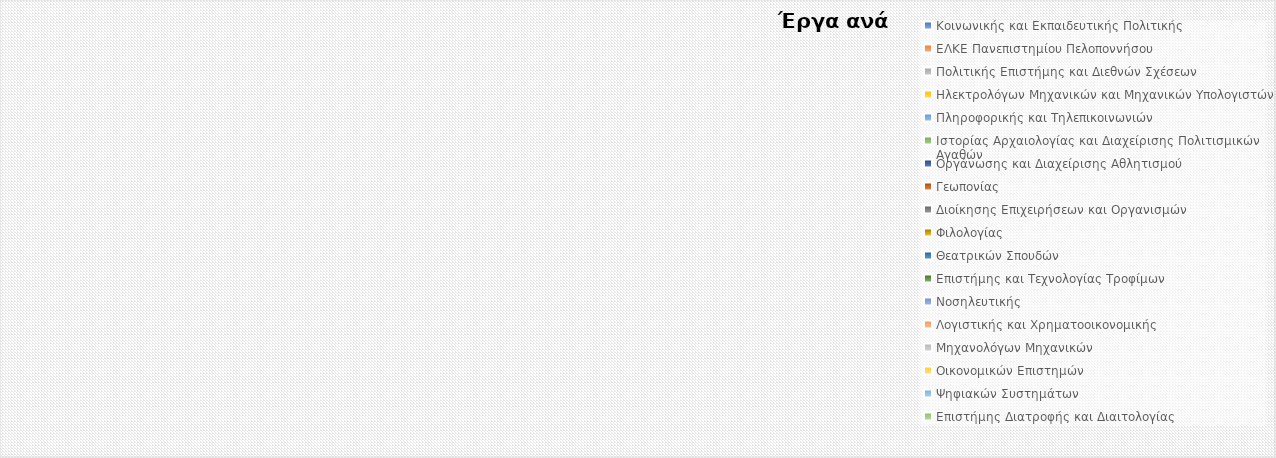
| Category | Series 0 |
|---|---|
| Κοινωνικής και Εκπαιδευτικής Πολιτικής | 0 |
| ΕΛΚΕ Πανεπιστημίου Πελοποννήσου | 0 |
| Πολιτικής Επιστήμης και Διεθνών Σχέσεων | 0 |
| Ηλεκτρολόγων Μηχανικών και Μηχανικών Υπολογιστών | 0 |
| Πληροφορικής και Τηλεπικοινωνιών | 0 |
| Ιστορίας Αρχαιολογίας και Διαχείρισης Πολιτισμικών Αγαθών | 0 |
| Οργάνωσης και Διαχείρισης Αθλητισμού | 0 |
| Γεωπονίας | 0 |
| Διοίκησης Επιχειρήσεων και Οργανισμών | 0 |
| Φιλολογίας | 0 |
| Θεατρικών Σπουδών | 0 |
| Επιστήμης και Τεχνολογίας Τροφίμων | 0 |
| Νοσηλευτικής | 0 |
| Λογιστικής και Χρηματοοικονομικής | 0 |
| Μηχανολόγων Μηχανικών | 0 |
| Οικονομικών Επιστημών | 0 |
| Ψηφιακών Συστημάτων | 0 |
| Επιστήμης Διατροφής και Διαιτολογίας | 0 |